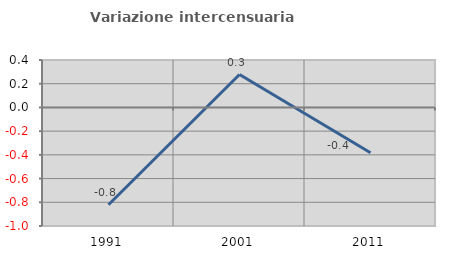
| Category | Variazione intercensuaria annua |
|---|---|
| 1991.0 | -0.821 |
| 2001.0 | 0.277 |
| 2011.0 | -0.382 |